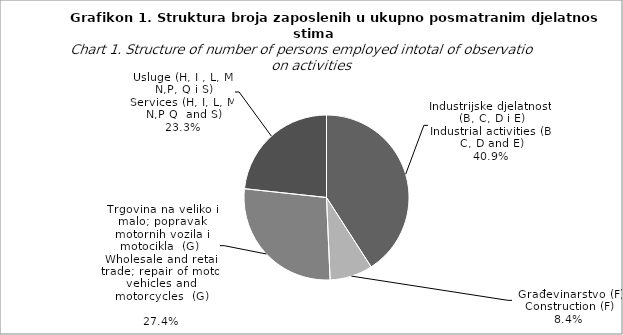
| Category | Broj zaposlenih osoba
Number of persons employed
  |
|---|---|
| Industrijske djelatnosti (B, C, D i E)
Industrial activities (B, C, D and E) | 40.9 |
| Građevinarstvo (F)
Construction (F) | 8.4 |
| Trgovina na veliko i malo; popravak motornih vozila i motocikla  (G) 
Wholesale and retail trade; repair of motor vehicles and motorcycles  (G)
 | 27.4 |
| Usluge (H, I i L)
Services (H, I and L) | 23.3 |